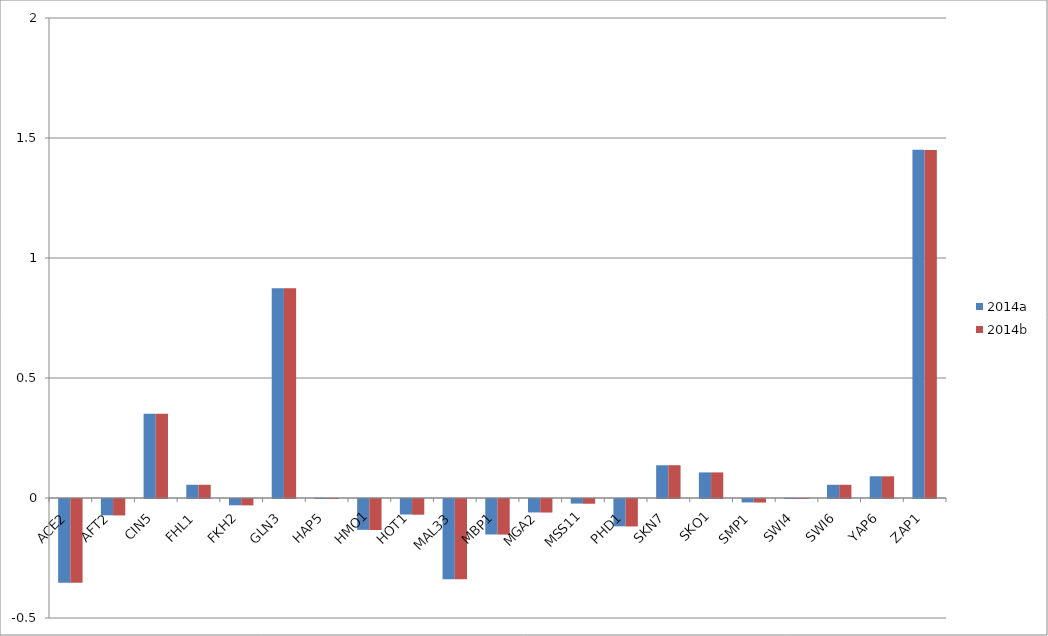
| Category | 2014a | 2014b |
|---|---|---|
| ACE2 | -0.349 | -0.349 |
| AFT2 | -0.068 | -0.068 |
| CIN5 | 0.351 | 0.351 |
| FHL1 | 0.055 | 0.055 |
| FKH2 | -0.026 | -0.027 |
| GLN3 | 0.874 | 0.874 |
| HAP5 | 0.001 | 0 |
| HMO1 | -0.129 | -0.129 |
| HOT1 | -0.065 | -0.065 |
| MAL33 | -0.334 | -0.334 |
| MBP1 | -0.148 | -0.148 |
| MGA2 | -0.056 | -0.056 |
| MSS11 | -0.019 | -0.02 |
| PHD1 | -0.114 | -0.114 |
| SKN7 | 0.136 | 0.137 |
| SKO1 | 0.107 | 0.107 |
| SMP1 | -0.014 | -0.015 |
| SWI4 | 0.001 | 0 |
| SWI6 | 0.055 | 0.055 |
| YAP6 | 0.091 | 0.09 |
| ZAP1 | 1.451 | 1.45 |